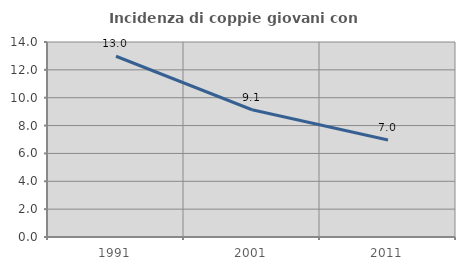
| Category | Incidenza di coppie giovani con figli |
|---|---|
| 1991.0 | 12.975 |
| 2001.0 | 9.136 |
| 2011.0 | 6.97 |